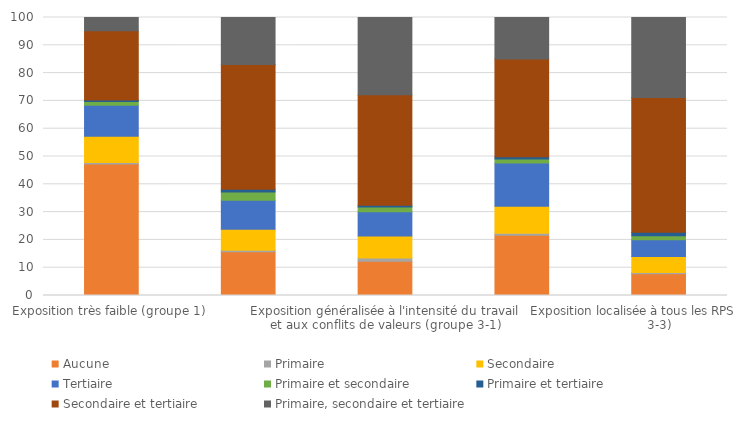
| Category | Aucune | Primaire | Secondaire | Tertiaire | Primaire et secondaire | Primaire et tertiaire | Secondaire et tertiaire | Primaire, secondaire et tertiaire |
|---|---|---|---|---|---|---|---|---|
| Exposition très faible (groupe 1) | 47.32 | 0.52 | 9.48 | 11.15 | 1.34 | 0.5 | 24.95 | 4.74 |
| Exposition faible et prévention variée (groupe 2) | 15.74 | 0.54 | 7.53 | 10.45 | 2.99 | 0.95 | 44.91 | 16.89 |
| Exposition généralisée à l'intensité du travail et aux conflits de valeurs (groupe 3-1) | 12.34 | 1.19 | 7.91 | 8.66 | 1.73 | 0.64 | 39.75 | 27.79 |
| Exposition généralisée aux tensions sociales (groupe 3-2) | 21.71 | 0.71 | 9.69 | 15.56 | 1.44 | 0.83 | 35.15 | 14.91 |
| Exposition localisée à tous les RPS (groupe 3-3) | 7.84 | 0.39 | 5.8 | 6.03 | 1.42 | 1.25 | 48.48 | 28.8 |